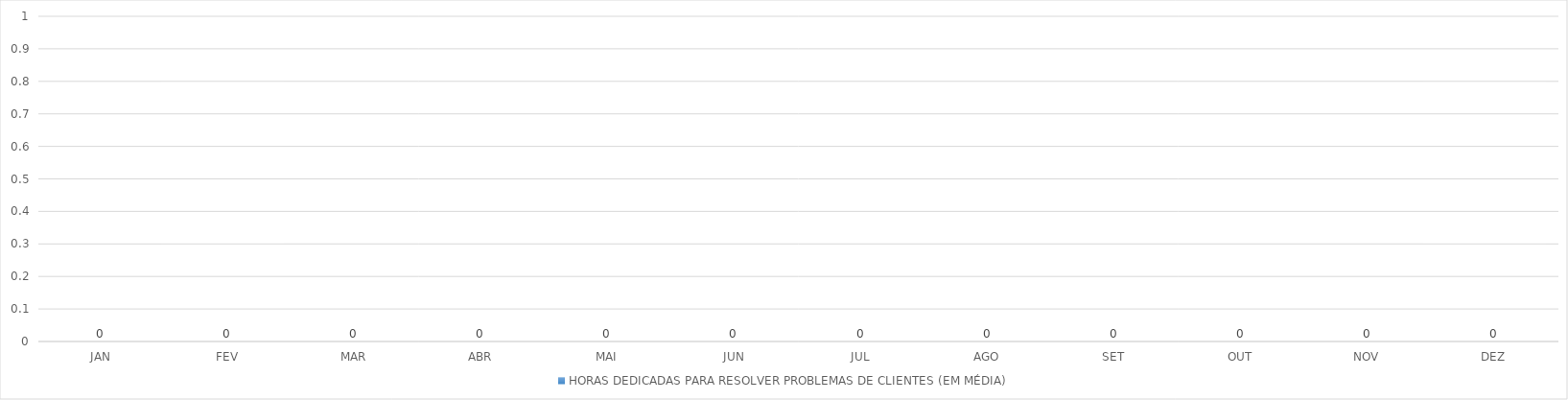
| Category | HORAS DEDICADAS PARA RESOLVER PROBLEMAS DE CLIENTES (EM MÉDIA) |
|---|---|
| JAN | 0 |
| FEV | 0 |
| MAR | 0 |
| ABR | 0 |
| MAI | 0 |
| JUN | 0 |
| JUL | 0 |
| AGO | 0 |
| SET | 0 |
| OUT | 0 |
| NOV | 0 |
| DEZ | 0 |